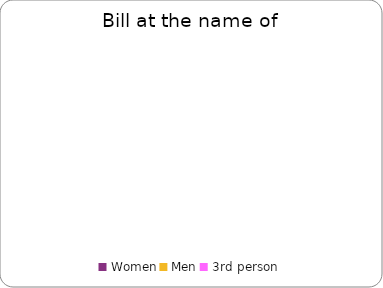
| Category | Series 0 |
|---|---|
| Women | 0 |
| Men | 0 |
| 3rd person | 0 |